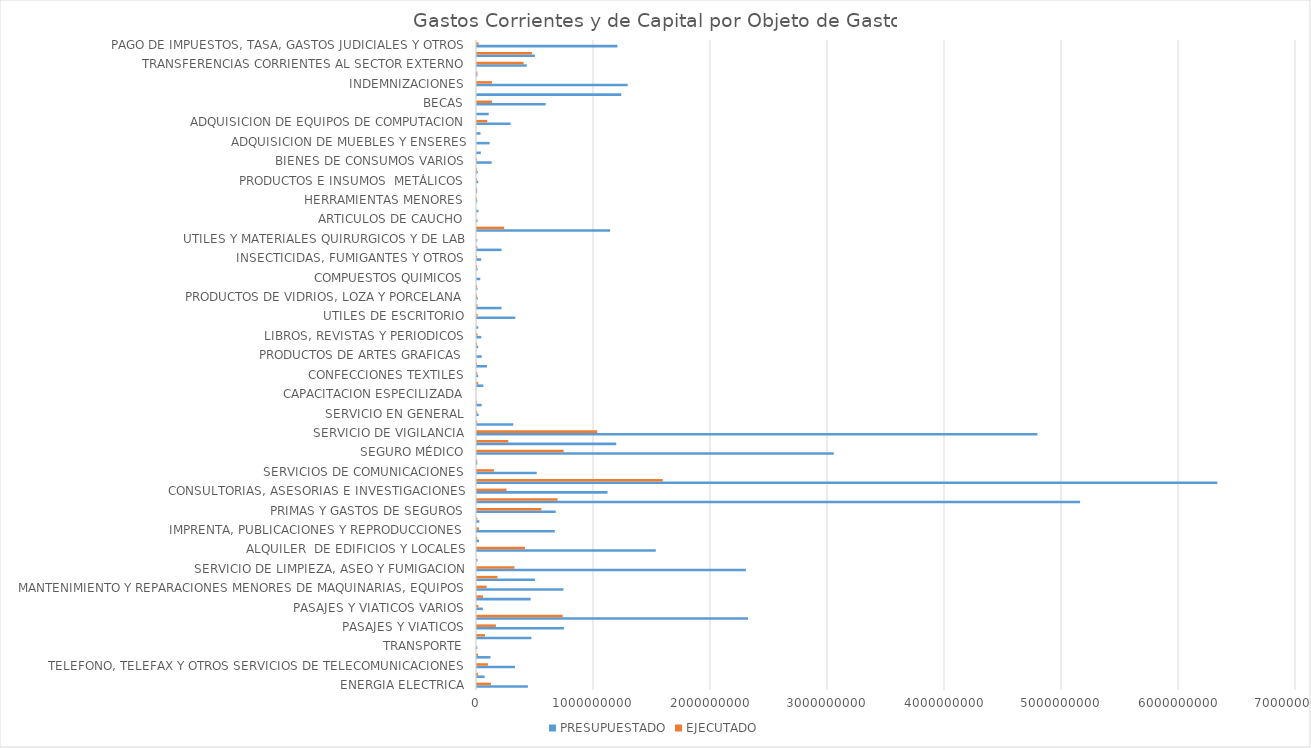
| Category | PRESUPUESTADO | EJECUTADO |
|---|---|---|
| ENERGIA ELECTRICA | 435000000 | 118687079 |
| AGUA | 64950000 | 9101487 |
| TELEFONO, TELEFAX Y OTROS SERVICIOS DE TELECOMUNICACIONES | 324050000 | 93364494 |
| CORREOS Y OTROS SERVICIOS POSTALES | 115000000 | 8145000 |
| TRANSPORTE | 2000000 | 0 |
| TRANSPORTE DE PERSONAS | 465000000 | 68174000 |
| PASAJES Y VIATICOS | 744093694 | 161772227 |
| VIATICOS Y MOVILIDAD | 2316633885 | 731797607 |
| PASAJES Y VIATICOS VARIOS | 50000000 | 11770680 |
| MANTENIMIENTO Y REPARACIONES MENORES DE EDIFICIOS Y LOCALES | 458291264 | 51004800 |
| MANTENIMIENTO Y REPARACIONES MENORES DE MAQUINARIAS, EQUIPOS | 739000000 | 81642000 |
| MANTEMIENTOS Y REPARACIONES MENORES DE EQUIPOS DE TRANSPORTE | 495000000 | 175121511 |
| SERVICIO DE LIMPIEZA, ASEO Y FUMIGACION | 2298000000 | 319795998 |
| MANTENIMIENTO Y REPACIONES MENORES DE INSTALACIONES | 5000000 | 0 |
| ALQUILER  DE EDIFICIOS Y LOCALES | 1528000000 | 409922713 |
| DE INFORMATICA Y SISTEMAS COMPUTARIZADOS | 17400000 | 1835000 |
| IMPRENTA, PUBLICACIONES Y REPRODUCCIONES | 664899992 | 16006400 |
| SERVICIOS BANCARIOS | 20000000 | 3008239 |
| PRIMAS Y GASTOS DE SEGUROS | 673000000 | 550497626 |
| PUBLICIDAD Y PROPAGANDA | 5154555703 | 688495391 |
| CONSULTORIAS, ASESORIAS E INVESTIGACIONES | 1115545357 | 252263332 |
| PROMOCIONES Y EXPOSICIONES | 6327882000 | 1587332934 |
| SERVICIOS DE COMUNICACIONES | 510000000 | 144516685 |
| SERVICIOS TECNICOS Y PROFESIONALES | 3000000 | 1510000 |
| SEGURO MÉDICO | 3049190000 | 740516000 |
| SERVICIO DE CEREMONIAL | 1190000000 | 267650148 |
| SERVICIO DE VIGILANCIA | 4789206250 | 1027685648 |
| SERVICIO DE CATERING | 310000570 | 1979050 |
| SERVICIO EN GENERAL | 13702500 | 2227500 |
| CAPACITACION DEL PERSONAL  DEL ESTADO | 40000000 | 1100000 |
| CAPACITACION ESPECILIZADA | 0 | 0 |
| ALIMENTOS PARA LAS PERSONAS | 53664000 | 10227780 |
| CONFECCIONES TEXTILES | 10000000 | 2800000 |
| PAPEL DE ESCRITORIO Y CARTON | 85000000 | 49893 |
| PRODUCTOS DE ARTES GRAFICAS | 40089000 | 0 |
| PRODUCTOS DE PAPEL Y CARTON | 10000000 | 81200 |
| LIBROS, REVISTAS Y PERIODICOS | 36195500 | 3988000 |
| ELEMENTOS DE LIMPIEZA | 10937500 | 0 |
| UTILES DE ESCRITORIO | 326929755 | 6073052 |
| UTILES Y MATERIALES ELECTRICOS | 210000000 | 4081300 |
| PRODUCTOS DE VIDRIOS, LOZA Y PORCELANA | 5850000 | 235000 |
| REPUESTOS Y ACCESORIOS MENORES | 4000000 | 272220 |
| COMPUESTOS QUIMICOS | 28000000 | 0 |
| PRODUCTOS FARMACEUTICOS | 5000000 | 209550 |
| INSECTICIDAS, FUMIGANTES Y OTROS | 36250000 | 1428500 |
| TINTAS, PINTURAS Y COLORANTES | 210095750 | 2990000 |
| UTILES Y MATERIALES QUIRURGICOS Y DE LAB | 2560000 | 0 |
| COMBUSTIBLES  | 1137784000 | 232228421 |
| ARTICULOS DE CAUCHO | 5140000 | 0 |
| CUBIERTAS Y CÁMARAS DE AIRE | 12000000 | 0 |
| HERRAMIENTAS MENORES | 2000000 | 887230 |
| ARTICULOS DE PLASTICOS | 1710000 | 374300 |
| PRODUCTOS E INSUMOS  METÁLICOS | 10000000 | 112500 |
| PRODUCTOS E INSUMOS NO METÁLICOS | 6500000 | 75000 |
| BIENES DE CONSUMOS VARIOS | 125540000 | 382300 |
| HERRAMIENTAS, APARATOS E INSTRUMENTOS EN GRAL  | 32800000 | 0 |
| ADQUISICION DE MUEBLES Y ENSERES | 108000000 | 0 |
| ADQUISICION DE EQUIPOS DE OFICINA Y COMPUTACIÓN | 30000000 | 0 |
| ADQUISICION DE EQUIPOS DE COMPUTACION | 287500000 | 87842000 |
| ACTIVOS INTAGIBLES | 100000000 | 0 |
| BECAS | 587000000 | 127560000 |
| APORTE A ENTIDADES EDUCATIVAS E INST. SIN FINES DE LUCRO | 1232766742 | 0 |
| INDEMNIZACIONES | 1288002486 | 128142486 |
| OTRAS TRANSFERENCIAS CORRIENTES | 3000000 | 2966828 |
| TRANSFERENCIAS CORRIENTES AL SECTOR EXTERNO | 425000000 | 398356318 |
| TRANSFERENCIAS CORRIENTES DEL SECTOR PRIVADO | 495000000 | 470000000 |
| PAGO DE IMPUESTOS, TASA, GASTOS JUDICIALES Y OTROS | 1200000000 | 13436563 |